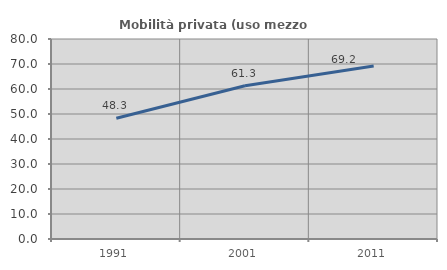
| Category | Mobilità privata (uso mezzo privato) |
|---|---|
| 1991.0 | 48.29 |
| 2001.0 | 61.279 |
| 2011.0 | 69.193 |